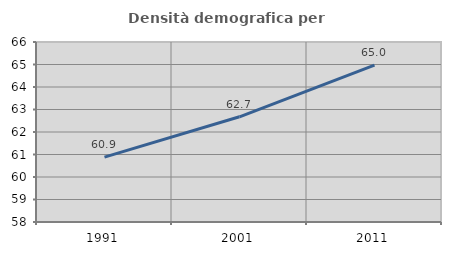
| Category | Densità demografica |
|---|---|
| 1991.0 | 60.885 |
| 2001.0 | 62.675 |
| 2011.0 | 64.973 |